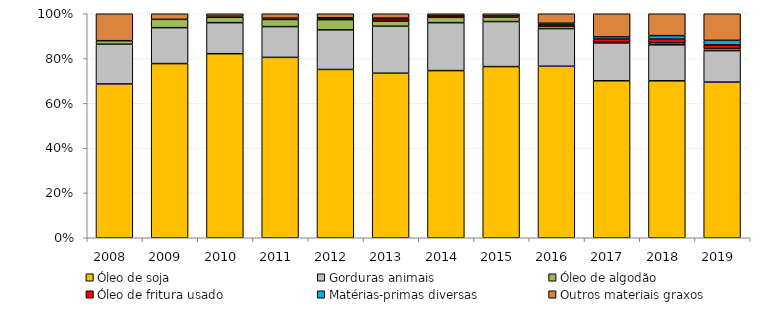
| Category | Óleo de soja | Gorduras animais | Óleo de algodão | Óleo de fritura usado | Matérias-primas diversas | Outros materiais graxos |
|---|---|---|---|---|---|---|
| 2008.0 | 0.687 | 0.177 | 0.016 | 0 | 0 | 0.12 |
| 2009.0 | 0.778 | 0.16 | 0.037 | 0 | 0 | 0.025 |
| 2010.0 | 0.822 | 0.139 | 0.024 | 0.002 | 0.003 | 0.011 |
| 2011.0 | 0.805 | 0.138 | 0.032 | 0.005 | 0.001 | 0.02 |
| 2012.0 | 0.751 | 0.177 | 0.045 | 0.007 | 0.002 | 0.018 |
| 2013.0 | 0.735 | 0.21 | 0.023 | 0.011 | 0.003 | 0.019 |
| 2014.0 | 0.746 | 0.214 | 0.024 | 0.008 | 0 | 0.008 |
| 2015.0 | 0.764 | 0.201 | 0.02 | 0.004 | 0.001 | 0.01 |
| 2016.0 | 0.766 | 0.168 | 0.011 | 0.007 | 0.006 | 0.042 |
| 2017.0 | 0.701 | 0.169 | 0.003 | 0.014 | 0.01 | 0.103 |
| 2018.0 | 0.701 | 0.161 | 0.009 | 0.017 | 0.015 | 0.098 |
| 2019.0 | 0.695 | 0.14 | 0.01 | 0.016 | 0.02 | 0.119 |